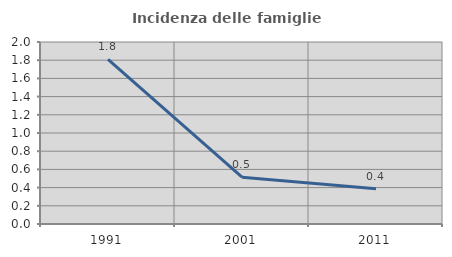
| Category | Incidenza delle famiglie numerose |
|---|---|
| 1991.0 | 1.81 |
| 2001.0 | 0.514 |
| 2011.0 | 0.389 |